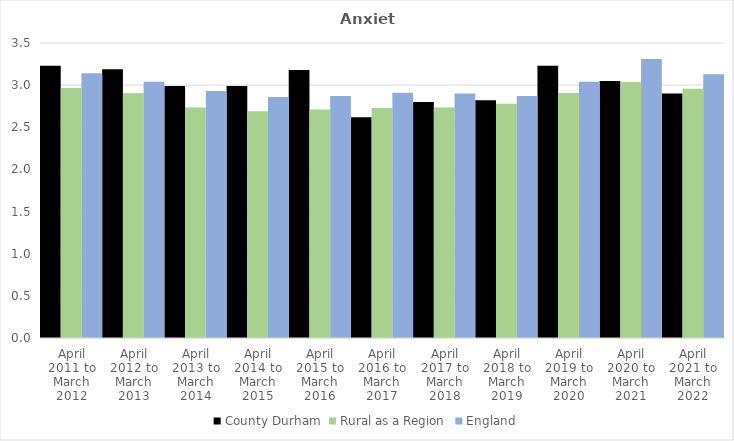
| Category | County Durham | Rural as a Region | England |
|---|---|---|---|
| April 2011 to March 2012 | 3.23 | 2.967 | 3.14 |
| April 2012 to March 2013 | 3.19 | 2.904 | 3.04 |
| April 2013 to March 2014 | 2.99 | 2.734 | 2.93 |
| April 2014 to March 2015 | 2.99 | 2.691 | 2.86 |
| April 2015 to March 2016 | 3.18 | 2.711 | 2.87 |
| April 2016 to March 2017 | 2.62 | 2.729 | 2.91 |
| April 2017 to March 2018 | 2.8 | 2.736 | 2.9 |
| April 2018 to March 2019 | 2.82 | 2.78 | 2.87 |
| April 2019 to March 2020 | 3.23 | 2.908 | 3.04 |
| April 2020 to March 2021 | 3.05 | 3.036 | 3.31 |
| April 2021 to March 2022 | 2.9 | 2.956 | 3.13 |